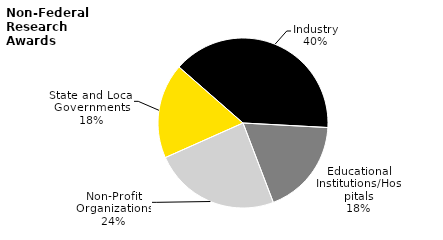
| Category | Series 0 |
|---|---|
| State and Local Governments | 32.813 |
| Industry | 71.423 |
| Educational Institutions/Hospitals | 33.242 |
| Non-Profit Organizations | 43.752 |